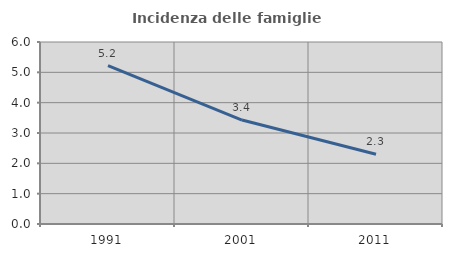
| Category | Incidenza delle famiglie numerose |
|---|---|
| 1991.0 | 5.224 |
| 2001.0 | 3.426 |
| 2011.0 | 2.298 |